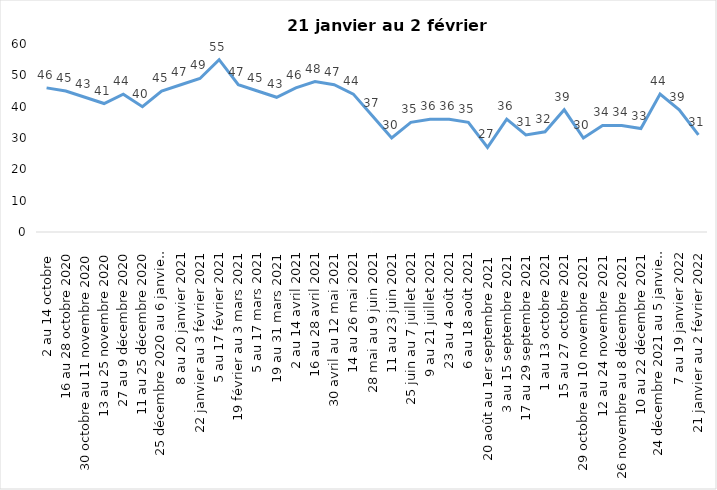
| Category | Toujours aux trois mesures |
|---|---|
| 2 au 14 octobre  | 46 |
| 16 au 28 octobre 2020 | 45 |
| 30 octobre au 11 novembre 2020 | 43 |
| 13 au 25 novembre 2020 | 41 |
| 27 au 9 décembre 2020 | 44 |
| 11 au 25 décembre 2020 | 40 |
| 25 décembre 2020 au 6 janvier 2021 | 45 |
| 8 au 20 janvier 2021 | 47 |
| 22 janvier au 3 février 2021 | 49 |
| 5 au 17 février 2021 | 55 |
| 19 février au 3 mars 2021 | 47 |
| 5 au 17 mars 2021 | 45 |
| 19 au 31 mars 2021 | 43 |
| 2 au 14 avril 2021 | 46 |
| 16 au 28 avril 2021 | 48 |
| 30 avril au 12 mai 2021 | 47 |
| 14 au 26 mai 2021 | 44 |
| 28 mai au 9 juin 2021 | 37 |
| 11 au 23 juin 2021 | 30 |
| 25 juin au 7 juillet 2021 | 35 |
| 9 au 21 juillet 2021 | 36 |
| 23 au 4 août 2021 | 36 |
| 6 au 18 août 2021 | 35 |
| 20 août au 1er septembre 2021 | 27 |
| 3 au 15 septembre 2021 | 36 |
| 17 au 29 septembre 2021 | 31 |
| 1 au 13 octobre 2021 | 32 |
| 15 au 27 octobre 2021 | 39 |
| 29 octobre au 10 novembre 2021 | 30 |
| 12 au 24 novembre 2021 | 34 |
| 26 novembre au 8 décembre 2021 | 34 |
| 10 au 22 décembre 2021 | 33 |
| 24 décembre 2021 au 5 janvier 2022 2022 | 44 |
| 7 au 19 janvier 2022 | 39 |
| 21 janvier au 2 février 2022 | 31 |